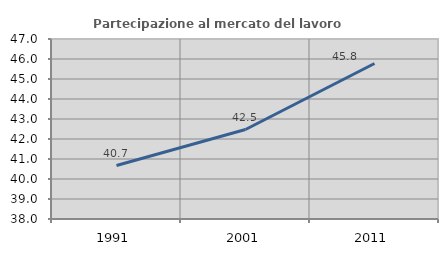
| Category | Partecipazione al mercato del lavoro  femminile |
|---|---|
| 1991.0 | 40.673 |
| 2001.0 | 42.474 |
| 2011.0 | 45.777 |